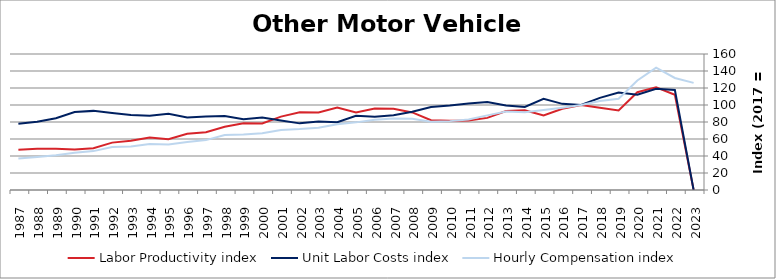
| Category | Labor Productivity index | Unit Labor Costs index | Hourly Compensation index |
|---|---|---|---|
| 2023.0 | 0 | 0 | 126.01 |
| 2022.0 | 112.023 | 117.646 | 131.791 |
| 2021.0 | 120.749 | 119.17 | 143.897 |
| 2020.0 | 115.036 | 111.971 | 128.806 |
| 2019.0 | 93.63 | 114.713 | 107.406 |
| 2018.0 | 96.686 | 108.381 | 104.789 |
| 2017.0 | 100 | 100 | 100 |
| 2016.0 | 95.482 | 101.337 | 96.758 |
| 2015.0 | 87.649 | 107.234 | 93.989 |
| 2014.0 | 93.76 | 97.687 | 91.591 |
| 2013.0 | 93.012 | 99.407 | 92.46 |
| 2012.0 | 84.857 | 103.477 | 87.808 |
| 2011.0 | 81.641 | 101.757 | 83.076 |
| 2010.0 | 81.475 | 99.452 | 81.029 |
| 2009.0 | 82.033 | 97.749 | 80.186 |
| 2008.0 | 91.242 | 91.992 | 83.936 |
| 2007.0 | 95.608 | 87.849 | 83.991 |
| 2006.0 | 95.989 | 86.108 | 82.655 |
| 2005.0 | 91.095 | 87.343 | 79.565 |
| 2004.0 | 97.128 | 79.752 | 77.462 |
| 2003.0 | 91.111 | 80.506 | 73.35 |
| 2002.0 | 91.418 | 78.393 | 71.665 |
| 2001.0 | 86.298 | 81.832 | 70.619 |
| 2000.0 | 78.257 | 85.364 | 66.803 |
| 1999.0 | 78.526 | 83.21 | 65.341 |
| 1998.0 | 74.441 | 87.019 | 64.778 |
| 1997.0 | 67.998 | 86.332 | 58.704 |
| 1996.0 | 66.051 | 85.403 | 56.41 |
| 1995.0 | 59.822 | 89.677 | 53.647 |
| 1994.0 | 61.868 | 87.495 | 54.131 |
| 1993.0 | 58.036 | 88.123 | 51.142 |
| 1992.0 | 55.73 | 90.595 | 50.489 |
| 1991.0 | 49.146 | 93.085 | 45.748 |
| 1990.0 | 47.6 | 91.802 | 43.697 |
| 1989.0 | 48.42 | 84.399 | 40.866 |
| 1988.0 | 48.538 | 80.184 | 38.92 |
| 1987.0 | 47.457 | 77.996 | 37.015 |